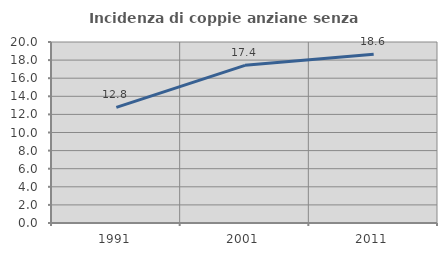
| Category | Incidenza di coppie anziane senza figli  |
|---|---|
| 1991.0 | 12.782 |
| 2001.0 | 17.42 |
| 2011.0 | 18.64 |